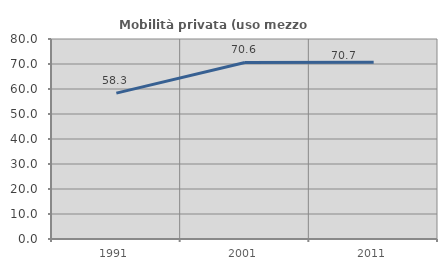
| Category | Mobilità privata (uso mezzo privato) |
|---|---|
| 1991.0 | 58.342 |
| 2001.0 | 70.625 |
| 2011.0 | 70.741 |